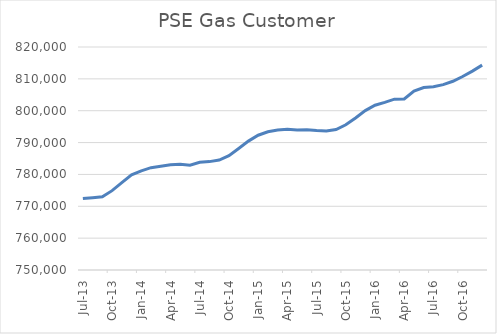
| Category | PSE Gas Customer |
|---|---|
| 2013-07-01 | 772452 |
| 2013-08-01 | 772691 |
| 2013-09-01 | 772979 |
| 2013-10-01 | 774909 |
| 2013-11-01 | 777427 |
| 2013-12-01 | 779856 |
| 2014-01-01 | 781140 |
| 2014-02-01 | 782124 |
| 2014-03-01 | 782576 |
| 2014-04-01 | 783011 |
| 2014-05-01 | 783224 |
| 2014-06-01 | 782865 |
| 2014-07-01 | 783819 |
| 2014-08-01 | 784025 |
| 2014-09-01 | 784522 |
| 2014-10-01 | 785890 |
| 2014-11-01 | 788144 |
| 2014-12-01 | 790463 |
| 2015-01-01 | 792308 |
| 2015-02-01 | 793380 |
| 2015-03-01 | 793969 |
| 2015-04-01 | 794157 |
| 2015-05-01 | 793958 |
| 2015-06-01 | 794030 |
| 2015-07-01 | 793756 |
| 2015-08-01 | 793631 |
| 2015-09-01 | 794098 |
| 2015-10-01 | 795585 |
| 2015-11-01 | 797721 |
| 2015-12-01 | 800034 |
| 2016-01-01 | 801729 |
| 2016-02-01 | 802634 |
| 2016-03-01 | 803618 |
| 2016-04-01 | 803704 |
| 2016-05-01 | 806170 |
| 2016-06-01 | 807258 |
| 2016-07-01 | 807505 |
| 2016-08-01 | 808189 |
| 2016-09-01 | 809248 |
| 2016-10-01 | 810739 |
| 2016-11-01 | 812436 |
| 2016-12-01 | 814304 |